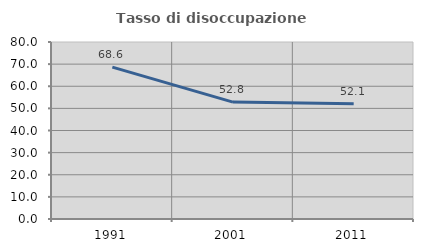
| Category | Tasso di disoccupazione giovanile  |
|---|---|
| 1991.0 | 68.627 |
| 2001.0 | 52.85 |
| 2011.0 | 52.083 |